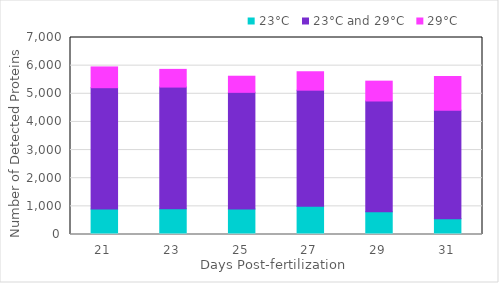
| Category | 23°C | 23°C and 29°C | 29°C |
|---|---|---|---|
| 21.0 | 904 | 4312 | 738 |
| 23.0 | 913 | 4325 | 629 |
| 25.0 | 906 | 4145 | 573 |
| 27.0 | 1005 | 4123 | 655 |
| 29.0 | 807 | 3937 | 705 |
| 31.0 | 561 | 3852 | 1202 |